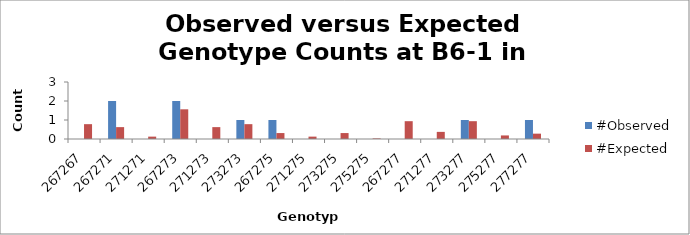
| Category | #Observed | #Expected |
|---|---|---|
| 267267.0 | 0 | 0.781 |
| 267271.0 | 2 | 0.625 |
| 271271.0 | 0 | 0.125 |
| 267273.0 | 2 | 1.562 |
| 271273.0 | 0 | 0.625 |
| 273273.0 | 1 | 0.781 |
| 267275.0 | 1 | 0.312 |
| 271275.0 | 0 | 0.125 |
| 273275.0 | 0 | 0.312 |
| 275275.0 | 0 | 0.031 |
| 267277.0 | 0 | 0.938 |
| 271277.0 | 0 | 0.375 |
| 273277.0 | 1 | 0.938 |
| 275277.0 | 0 | 0.188 |
| 277277.0 | 1 | 0.281 |